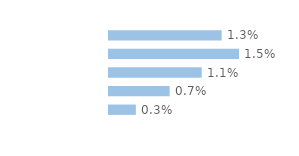
| Category | Series 0 |
|---|---|
| 18-29 ans | 0.013 |
| 30-39 ans | 0.015 |
| 40-49 ans | 0.011 |
| 50-59 ans | 0.007 |
| 60-75 ans | 0.003 |